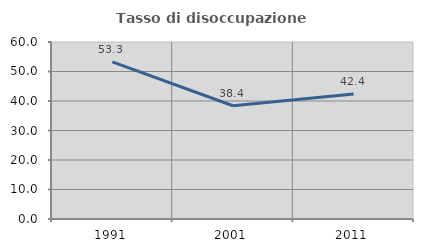
| Category | Tasso di disoccupazione giovanile  |
|---|---|
| 1991.0 | 53.277 |
| 2001.0 | 38.388 |
| 2011.0 | 42.391 |